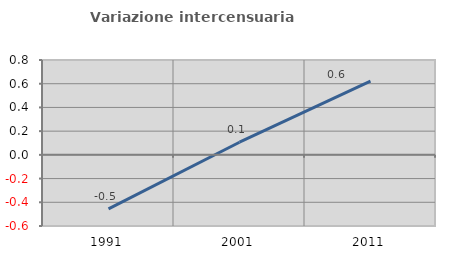
| Category | Variazione intercensuaria annua |
|---|---|
| 1991.0 | -0.456 |
| 2001.0 | 0.107 |
| 2011.0 | 0.623 |